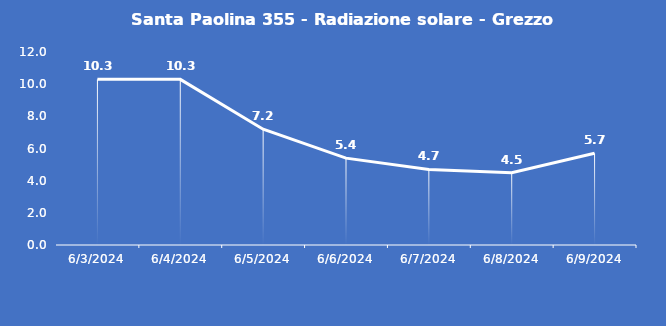
| Category | Santa Paolina 355 - Radiazione solare - Grezzo (W/m2) |
|---|---|
| 6/3/24 | 10.3 |
| 6/4/24 | 10.3 |
| 6/5/24 | 7.2 |
| 6/6/24 | 5.4 |
| 6/7/24 | 4.7 |
| 6/8/24 | 4.5 |
| 6/9/24 | 5.7 |